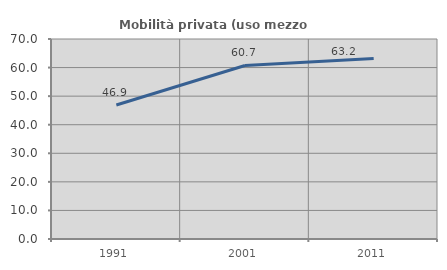
| Category | Mobilità privata (uso mezzo privato) |
|---|---|
| 1991.0 | 46.914 |
| 2001.0 | 60.738 |
| 2011.0 | 63.197 |